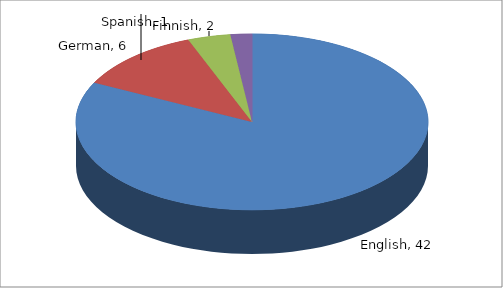
| Category | Series 0 |
|---|---|
| English | 42 |
| German | 6 |
| Finnish | 2 |
| Spanish | 1 |